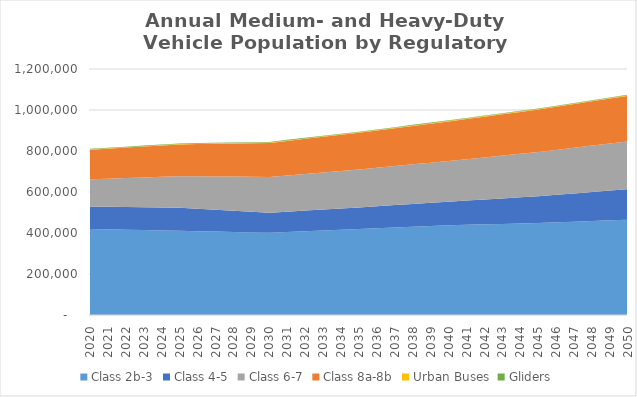
| Category | Class 2b-3 | Class 4-5 | Class 6-7 | Class 8a-8b | Urban Buses | Gliders |
|---|---|---|---|---|---|---|
| 2020.0 | 420000 | 109630 | 132050 | 144670 | 1710 | 2510 |
| 2021.0 | 418100 | 110360 | 136320 | 146770 | 1760 | 2550 |
| 2022.0 | 416200 | 111080 | 140590 | 148860 | 1810 | 2580 |
| 2023.0 | 414310 | 111810 | 144850 | 150960 | 1850 | 2620 |
| 2024.0 | 412410 | 112530 | 149120 | 153050 | 1900 | 2650 |
| 2025.0 | 410510 | 113260 | 153390 | 155150 | 1950 | 2690 |
| 2026.0 | 408610 | 110210 | 157660 | 157250 | 2000 | 2720 |
| 2027.0 | 406710 | 107170 | 161930 | 159350 | 2050 | 2760 |
| 2028.0 | 404810 | 104120 | 166190 | 161440 | 2090 | 2790 |
| 2029.0 | 402910 | 101080 | 170460 | 163540 | 2140 | 2830 |
| 2030.0 | 401010 | 98030 | 174730 | 165640 | 2190 | 2860 |
| 2031.0 | 404730 | 99450 | 176860 | 168260 | 2240 | 2860 |
| 2032.0 | 408450 | 100860 | 179000 | 170880 | 2290 | 2860 |
| 2033.0 | 412180 | 102280 | 181130 | 173510 | 2330 | 2850 |
| 2034.0 | 415900 | 103690 | 183270 | 176130 | 2380 | 2850 |
| 2035.0 | 419620 | 105110 | 185400 | 178750 | 2430 | 2850 |
| 2036.0 | 423240 | 107150 | 188020 | 181560 | 2480 | 2830 |
| 2037.0 | 426850 | 109200 | 190640 | 184370 | 2530 | 2810 |
| 2038.0 | 430470 | 111240 | 193260 | 187170 | 2590 | 2780 |
| 2039.0 | 434080 | 113290 | 195880 | 189980 | 2640 | 2760 |
| 2040.0 | 437700 | 115330 | 198500 | 192790 | 2690 | 2740 |
| 2041.0 | 439920 | 118390 | 201880 | 195710 | 2740 | 2720 |
| 2042.0 | 442140 | 121440 | 205270 | 198620 | 2790 | 2700 |
| 2043.0 | 444360 | 124500 | 208650 | 201540 | 2830 | 2690 |
| 2044.0 | 446580 | 127550 | 212040 | 204450 | 2880 | 2670 |
| 2045.0 | 448800 | 130610 | 215420 | 207370 | 2930 | 2650 |
| 2046.0 | 452120 | 134200 | 219050 | 210240 | 2980 | 2620 |
| 2047.0 | 455440 | 137780 | 222680 | 213110 | 3030 | 2590 |
| 2048.0 | 458750 | 141370 | 226300 | 215980 | 3090 | 2560 |
| 2049.0 | 462070 | 144950 | 229930 | 218850 | 3140 | 2530 |
| 2050.0 | 465390 | 148540 | 233560 | 221720 | 3190 | 2500 |